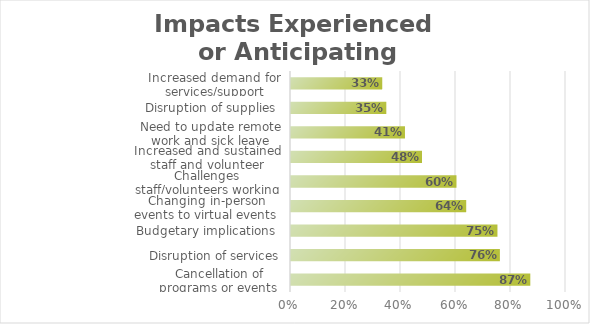
| Category | Total replies | % Total replies | %  total survey respondents |
|---|---|---|---|
| Cancellation of programs or events  |  |  | 0.87 |
| Disruption of services |  |  | 0.76 |
| Budgetary implications  |  |  | 0.751 |
| Changing in-person events to virtual events  |  |  | 0.637 |
| Challenges staff/volunteers working remotely |  |  | 0.602 |
| Increased and sustained staff and volunteer absences |  |  | 0.476 |
| Need to update remote work and sick leave policies  |  |  | 0.414 |
| Disruption of supplies  |  |  | 0.347 |
| Increased demand for services/support |  |  | 0.332 |